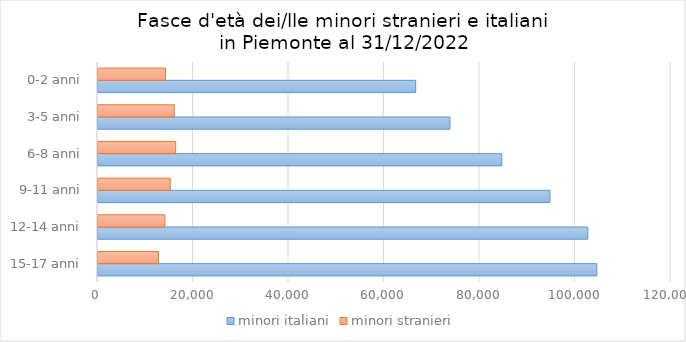
| Category | minori italiani | minori stranieri |
|---|---|---|
| 15-17 anni | 104458 | 12668 |
| 12-14 anni | 102586 | 14031 |
| 9-11 anni | 94650 | 15143 |
| 6-8 anni | 84576 | 16268 |
| 3-5 anni | 73714 | 15978 |
| 0-2 anni | 66533 | 14126 |